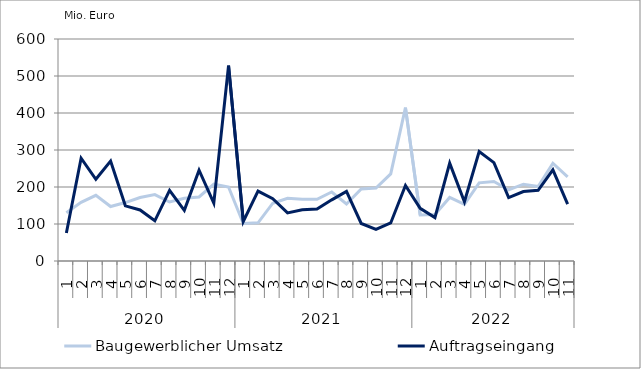
| Category | Baugewerblicher Umsatz | Auftragseingang |
|---|---|---|
| 0 | 130445.562 | 75891.481 |
| 1 | 158433.655 | 277923.85 |
| 2 | 177529.832 | 220973.626 |
| 3 | 147259.799 | 269936.091 |
| 4 | 157965.891 | 149072.895 |
| 5 | 171647.778 | 137984.76 |
| 6 | 179530.732 | 108645.965 |
| 7 | 159480.457 | 190771.468 |
| 8 | 169638.111 | 136988.906 |
| 9 | 173040.053 | 245341.603 |
| 10 | 207619.085 | 156647.224 |
| 11 | 199947.086 | 528166.004 |
| 12 | 101295.895 | 106850.127 |
| 13 | 103236.543 | 188883.434 |
| 14 | 156172.725 | 168204.42 |
| 15 | 169257.088 | 130052.073 |
| 16 | 166897.821 | 138492.214 |
| 17 | 166720.216 | 140262.426 |
| 18 | 186515.191 | 165331.191 |
| 19 | 154188.941 | 188169.655 |
| 20 | 194464.12 | 101359.538 |
| 21 | 197281.201 | 85626.862 |
| 22 | 235325.083 | 102880.924 |
| 23 | 414469.471 | 203900.676 |
| 24 | 124217.549 | 142351.759 |
| 25 | 125619.696 | 117194.423 |
| 26 | 171896.664 | 264509.013 |
| 27 | 153384.654 | 160146.519 |
| 28 | 211335.38 | 295997.826 |
| 29 | 214914.164 | 265813.917 |
| 30 | 192047.613 | 171529.517 |
| 31 | 207577.681 | 187809.656 |
| 32 | 201109.781 | 190941.096 |
| 33 | 264135.048 | 246250.021 |
| 34 | 227299.047 | 153783.993 |